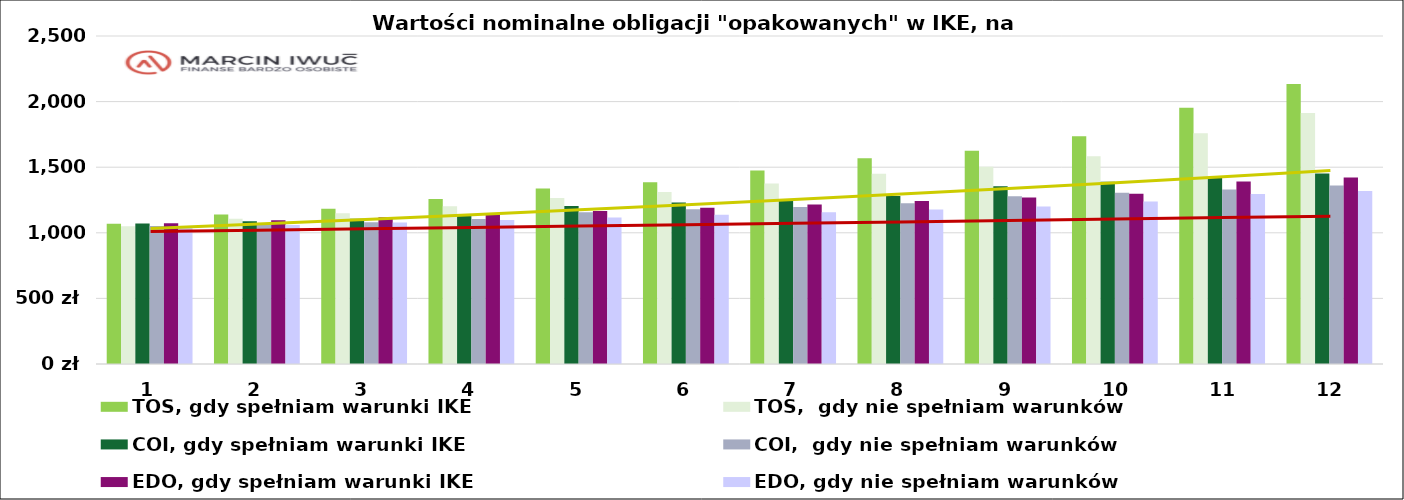
| Category | TOS, gdy spełniam warunki IKE | TOS,  gdy nie spełniam warunków | COI, gdy spełniam warunki IKE | COI,  gdy nie spełniam warunków | EDO, gdy spełniam warunki IKE | EDO, gdy nie spełniam warunków |
|---|---|---|---|---|---|---|
| 0 | 1068.5 | 1049.815 | 1070 | 1051.03 | 1072.5 | 1042.525 |
| 1 | 1139.866 | 1107.274 | 1088.256 | 1065.486 | 1094.877 | 1060.317 |
| 2 | 1183.752 | 1148.154 | 1106.591 | 1080.021 | 1117.869 | 1078.621 |
| 3 | 1258.433 | 1202.072 | 1131.999 | 1105.402 | 1141.493 | 1097.451 |
| 4 | 1337.197 | 1265.539 | 1203.426 | 1157.289 | 1165.766 | 1116.823 |
| 5 | 1385.758 | 1310.792 | 1230.939 | 1178.725 | 1190.705 | 1136.75 |
| 6 | 1474.474 | 1374.971 | 1253.55 | 1196.776 | 1216.328 | 1157.249 |
| 7 | 1568.044 | 1450.463 | 1281.358 | 1224.725 | 1242.652 | 1178.333 |
| 8 | 1625.773 | 1504.282 | 1354.991 | 1278.438 | 1269.569 | 1199.893 |
| 9 | 1735.122 | 1583.451 | 1389.688 | 1305.709 | 1297.092 | 1238.137 |
| 10 | 1953.789 | 1759.63 | 1421.252 | 1330.436 | 1391.236 | 1295.268 |
| 11 | 2134.986 | 1913.928 | 1452.882 | 1361.447 | 1421.169 | 1319.241 |